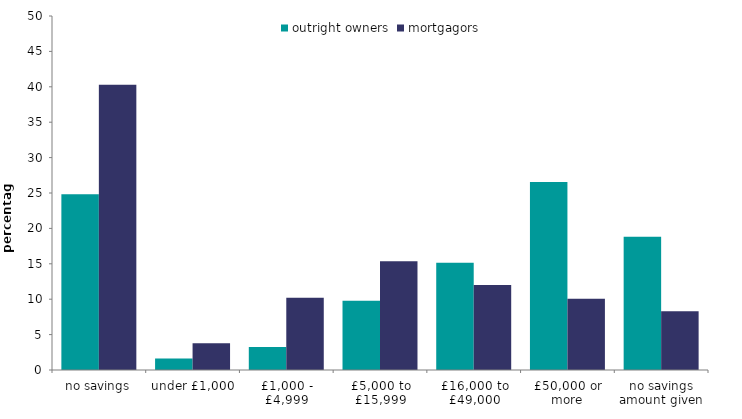
| Category | outright owners | mortgagors |
|---|---|---|
| no savings | 24.807 | 40.275 |
| under £1,000 | 1.618 | 3.776 |
| £1,000 - £4,999 | 3.258 | 10.203 |
| £5,000 to £15,999 | 9.775 | 15.359 |
| £16,000 to £49,000 | 15.15 | 12.003 |
| £50,000 or more | 26.561 | 10.079 |
| no savings amount given | 18.832 | 8.305 |